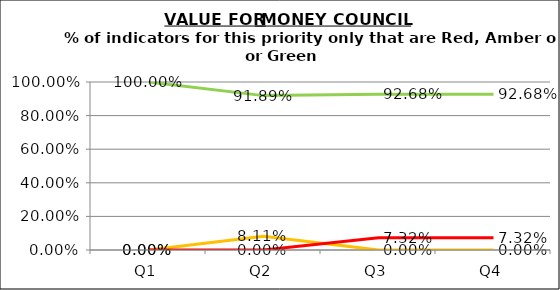
| Category | Green | Amber | Red |
|---|---|---|---|
| Q1 | 1 | 0 | 0 |
| Q2 | 0.919 | 0.081 | 0 |
| Q3 | 0.927 | 0 | 0.073 |
| Q4 | 0.927 | 0 | 0.073 |